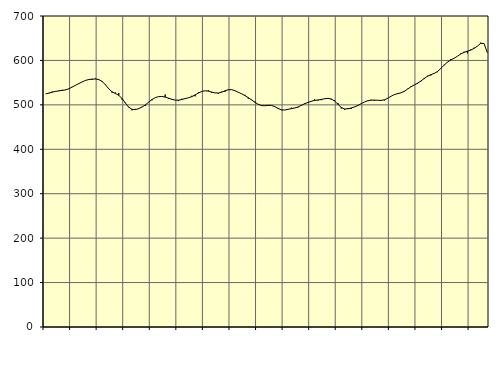
| Category | Piggar | Series 1 |
|---|---|---|
| nan | 524.6 | 524.71 |
| 87.0 | 525.9 | 526.51 |
| 87.0 | 530 | 528.54 |
| 87.0 | 529.6 | 530.32 |
| nan | 531 | 531.52 |
| 88.0 | 534 | 532.47 |
| 88.0 | 533.3 | 533.77 |
| 88.0 | 535.7 | 536.25 |
| nan | 540.6 | 540.06 |
| 89.0 | 543.9 | 544.14 |
| 89.0 | 547.3 | 547.87 |
| 89.0 | 551.5 | 551.7 |
| nan | 555.4 | 555.05 |
| 90.0 | 557.7 | 556.99 |
| 90.0 | 556.3 | 557.95 |
| 90.0 | 559.4 | 558.21 |
| nan | 557.6 | 556.9 |
| 91.0 | 551.7 | 552.66 |
| 91.0 | 545.8 | 545.16 |
| 91.0 | 535.7 | 536.21 |
| nan | 527.2 | 529.28 |
| 92.0 | 527.8 | 525.47 |
| 92.0 | 526.8 | 521.62 |
| 92.0 | 512 | 514.27 |
| nan | 504.8 | 504 |
| 93.0 | 494.2 | 494.96 |
| 93.0 | 487.6 | 489.99 |
| 93.0 | 491 | 489.26 |
| nan | 492.3 | 491.47 |
| 94.0 | 495.5 | 494.99 |
| 94.0 | 497.9 | 499.77 |
| 94.0 | 506.6 | 505.88 |
| nan | 510.1 | 511.85 |
| 95.0 | 516.1 | 516.17 |
| 95.0 | 518.6 | 518.57 |
| 95.0 | 519.1 | 518.92 |
| nan | 523.4 | 517.39 |
| 96.0 | 513.2 | 515.04 |
| 96.0 | 513.1 | 512.44 |
| 96.0 | 510.6 | 510.65 |
| nan | 508.4 | 510.54 |
| 97.0 | 513.7 | 511.96 |
| 97.0 | 514.5 | 514.11 |
| 97.0 | 515.8 | 515.91 |
| nan | 520.4 | 518.43 |
| 98.0 | 519.2 | 522.37 |
| 98.0 | 528 | 526.69 |
| 98.0 | 530.7 | 530.13 |
| nan | 531.8 | 531.71 |
| 99.0 | 532.9 | 530.93 |
| 99.0 | 527.1 | 528.75 |
| 99.0 | 526.8 | 526.88 |
| nan | 525.1 | 526.68 |
| 0.0 | 529.6 | 528.57 |
| 0.0 | 529.4 | 531.58 |
| 0.0 | 533.6 | 534.07 |
| nan | 534.5 | 534.24 |
| 1.0 | 532.2 | 531.79 |
| 1.0 | 528.8 | 528.44 |
| 1.0 | 525.3 | 525 |
| nan | 522.6 | 520.9 |
| 2.0 | 514 | 516.16 |
| 2.0 | 511.8 | 511.12 |
| 2.0 | 507.4 | 505.92 |
| nan | 500.5 | 501.24 |
| 3.0 | 498 | 498.41 |
| 3.0 | 498.2 | 498.04 |
| 3.0 | 498.1 | 498.89 |
| nan | 498.9 | 498.66 |
| 4.0 | 496.5 | 495.98 |
| 4.0 | 490.6 | 491.85 |
| 4.0 | 487.9 | 488.79 |
| nan | 488.5 | 488.38 |
| 5.0 | 490.3 | 489.98 |
| 5.0 | 493.7 | 491.57 |
| 5.0 | 493.4 | 492.95 |
| nan | 494.2 | 495.28 |
| 6.0 | 499.6 | 498.91 |
| 6.0 | 503.6 | 502.62 |
| 6.0 | 504.2 | 505.51 |
| nan | 507.9 | 508.18 |
| 7.0 | 512.3 | 510.05 |
| 7.0 | 509.9 | 511.01 |
| 7.0 | 510.5 | 512.21 |
| nan | 514.2 | 513.73 |
| 8.0 | 515.3 | 514.6 |
| 8.0 | 512.1 | 513.25 |
| 8.0 | 510.7 | 508.71 |
| nan | 503.9 | 501.49 |
| 9.0 | 491.9 | 494.07 |
| 9.0 | 488.7 | 490.74 |
| 9.0 | 492.7 | 491.1 |
| nan | 490.6 | 492.9 |
| 10.0 | 495.1 | 495.29 |
| 10.0 | 497.5 | 498.61 |
| 10.0 | 502.5 | 502.64 |
| nan | 506.4 | 506.44 |
| 11.0 | 509.6 | 509.22 |
| 11.0 | 511.5 | 510.51 |
| 11.0 | 509.2 | 510.77 |
| nan | 510.2 | 510.29 |
| 12.0 | 510.6 | 510.01 |
| 12.0 | 510.1 | 511.46 |
| 12.0 | 514.8 | 514.8 |
| nan | 519.3 | 519.31 |
| 13.0 | 522.4 | 523.06 |
| 13.0 | 526.7 | 525.22 |
| 13.0 | 527 | 527.1 |
| nan | 531.4 | 530.41 |
| 14.0 | 536.2 | 535.61 |
| 14.0 | 541.7 | 540.67 |
| 14.0 | 545.1 | 544.74 |
| nan | 547.4 | 548.82 |
| 15.0 | 553 | 553.76 |
| 15.0 | 558 | 559.44 |
| 15.0 | 565.5 | 564.36 |
| nan | 566.1 | 567.99 |
| 16.0 | 570.4 | 570.79 |
| 16.0 | 573.5 | 575.22 |
| 16.0 | 582.3 | 581.99 |
| nan | 590.4 | 589.51 |
| 17.0 | 595.7 | 596.21 |
| 17.0 | 603 | 601.1 |
| 17.0 | 605.3 | 604.91 |
| nan | 609.6 | 609.51 |
| 18.0 | 615.4 | 614.4 |
| 18.0 | 619.6 | 618.23 |
| 18.0 | 616 | 620.7 |
| nan | 624.7 | 623.22 |
| 19.0 | 628.6 | 627.1 |
| 19.0 | 632 | 632.18 |
| 19.0 | 640 | 638.43 |
| nan | 637.6 | 638.1 |
| 20.0 | 617.2 | 617.57 |